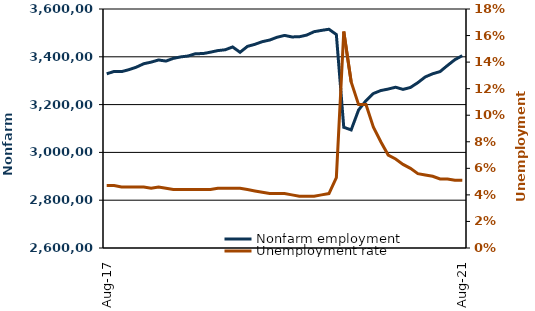
| Category |  Nonfarm employment  |
|---|---|
| 2017-08-01 | 3328800 |
| 2017-09-01 | 3338800 |
| 2017-10-01 | 3338000 |
| 2017-11-01 | 3346100 |
| 2017-12-01 | 3356700 |
| 2018-01-01 | 3371000 |
| 2018-02-01 | 3377700 |
| 2018-03-01 | 3386700 |
| 2018-04-01 | 3382100 |
| 2018-05-01 | 3393500 |
| 2018-06-01 | 3399600 |
| 2018-07-01 | 3403400 |
| 2018-08-01 | 3413100 |
| 2018-09-01 | 3413400 |
| 2018-10-01 | 3419300 |
| 2018-11-01 | 3426000 |
| 2018-12-01 | 3429400 |
| 2019-01-01 | 3441200 |
| 2019-02-01 | 3418800 |
| 2019-03-01 | 3443700 |
| 2019-04-01 | 3452200 |
| 2019-05-01 | 3463300 |
| 2019-06-01 | 3470100 |
| 2019-07-01 | 3481800 |
| 2019-08-01 | 3489500 |
| 2019-09-01 | 3483200 |
| 2019-10-01 | 3483800 |
| 2019-11-01 | 3490900 |
| 2019-12-01 | 3505100 |
| 2020-01-01 | 3510500 |
| 2020-02-01 | 3515300 |
| 2020-03-01 | 3493100 |
| 2020-04-01 | 3105100 |
| 2020-05-01 | 3094100 |
| 2020-06-01 | 3177500 |
| 2020-07-01 | 3216400 |
| 2020-08-01 | 3246500 |
| 2020-09-01 | 3258900 |
| 2020-10-01 | 3265100 |
| 2020-11-01 | 3272700 |
| 2020-12-01 | 3263600 |
| 2021-01-01 | 3271700 |
| 2021-02-01 | 3291900 |
| 2021-03-01 | 3315800 |
| 2021-04-01 | 3329000 |
| 2021-05-01 | 3338100 |
| 2021-06-01 | 3363700 |
| 2021-07-01 | 3388000 |
| 2021-08-01 | 3404800 |